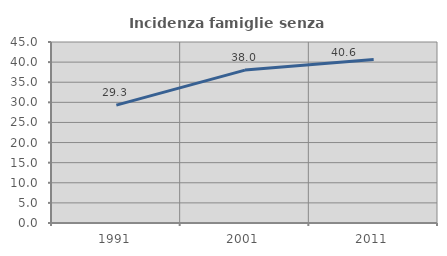
| Category | Incidenza famiglie senza nuclei |
|---|---|
| 1991.0 | 29.31 |
| 2001.0 | 38.017 |
| 2011.0 | 40.625 |